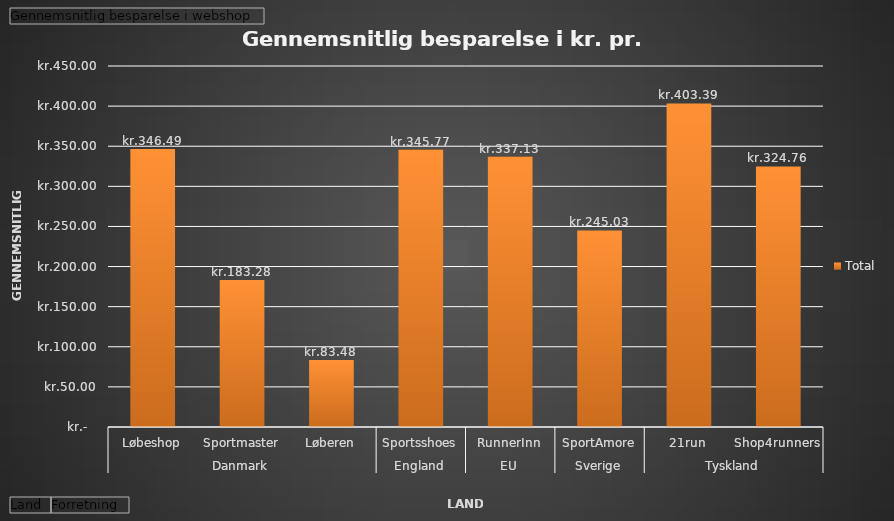
| Category | Total |
|---|---|
| 0 | 346.493 |
| 1 | 183.278 |
| 2 | 83.485 |
| 3 | 345.765 |
| 4 | 337.132 |
| 5 | 245.033 |
| 6 | 403.386 |
| 7 | 324.76 |